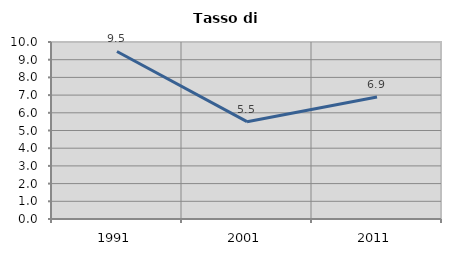
| Category | Tasso di disoccupazione   |
|---|---|
| 1991.0 | 9.465 |
| 2001.0 | 5.498 |
| 2011.0 | 6.898 |